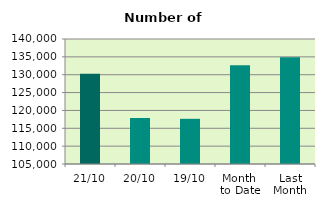
| Category | Series 0 |
|---|---|
| 21/10 | 130286 |
| 20/10 | 117882 |
| 19/10 | 117650 |
| Month 
to Date | 132669.6 |
| Last
Month | 134880 |